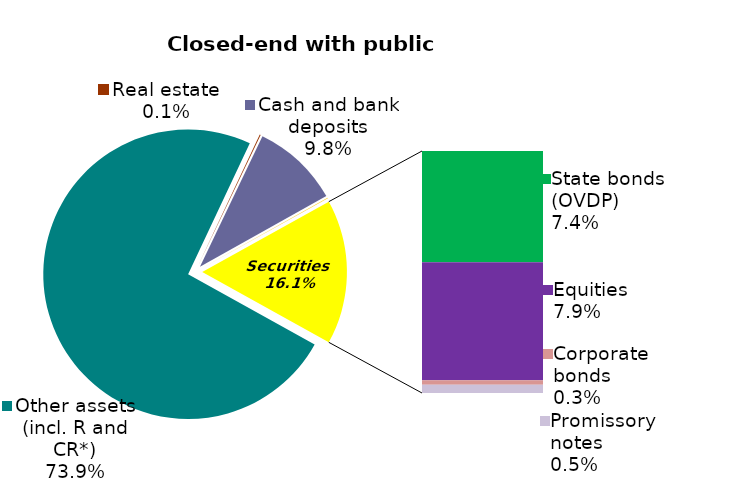
| Category | Series 0 |
|---|---|
| Other assets (incl. R and CR*) | 0.739 |
| Real estate | 0.001 |
| Cash and bank deposits | 0.098 |
| Bank metals | 0 |
| State bonds (OVDP) | 0.074 |
| Equities | 0.079 |
| Corporate bonds | 0.003 |
| Promissory notes | 0.005 |